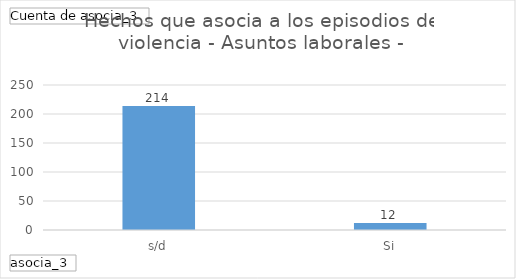
| Category | Total |
|---|---|
| s/d | 214 |
| Si | 12 |